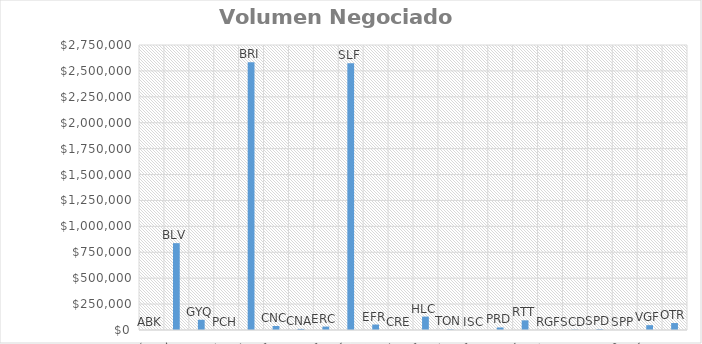
| Category | Volumen |
|---|---|
| ABK | 0 |
| BLV | 837904.75 |
| GYQ | 98619.92 |
| PCH | 0 |
| BRI | 2584000 |
| CNC | 38820 |
| CNA | 10741.6 |
| ERC | 32917 |
| SLF | 2574246.5 |
| EFR | 52717.6 |
| CRE | 0 |
| HLC | 129325 |
| TON | 5674.5 |
| ISC | 0 |
| PRD | 24332.61 |
| RTT | 93345 |
| RGF | 0 |
| SCD | 3086.1 |
| SPD | 7423.35 |
| SPP | 497.25 |
| VGF | 46628.4 |
| OTR | 67051.2 |